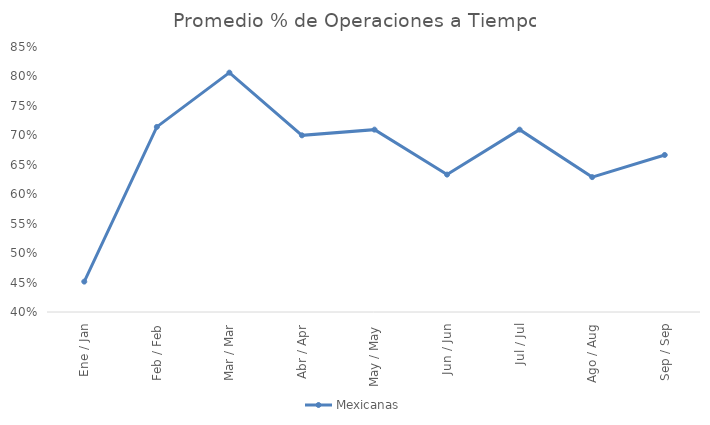
| Category | Mexicanas |
|---|---|
| Ene / Jan | 0.452 |
| Feb / Feb | 0.714 |
| Mar / Mar | 0.806 |
| Abr / Apr | 0.7 |
| May / May | 0.71 |
| Jun / Jun | 0.633 |
| Jul / Jul | 0.71 |
| Ago / Aug | 0.629 |
| Sep / Sep | 0.667 |